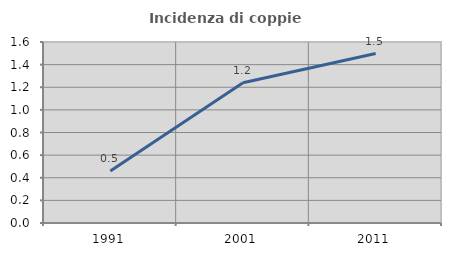
| Category | Incidenza di coppie miste |
|---|---|
| 1991.0 | 0.461 |
| 2001.0 | 1.24 |
| 2011.0 | 1.498 |